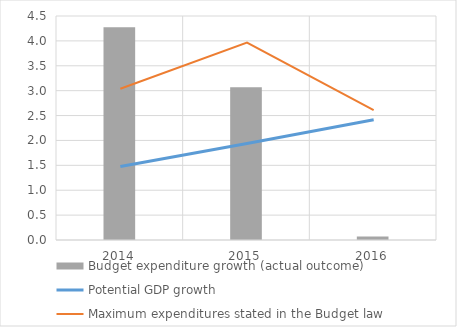
| Category | Budget expenditure growth (actual outcome) |
|---|---|
| 0 | 4.276 |
| 1 | 3.069 |
| 2 | 0.07 |